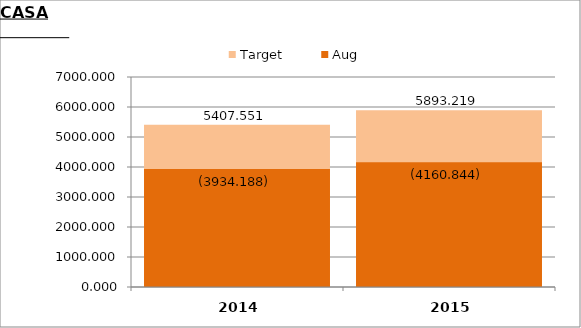
| Category | Target | Aug |
|---|---|---|
| 2014.0 | 5407.551 | 3934.188 |
| 2015.0 | 5893.219 | 4160.844 |